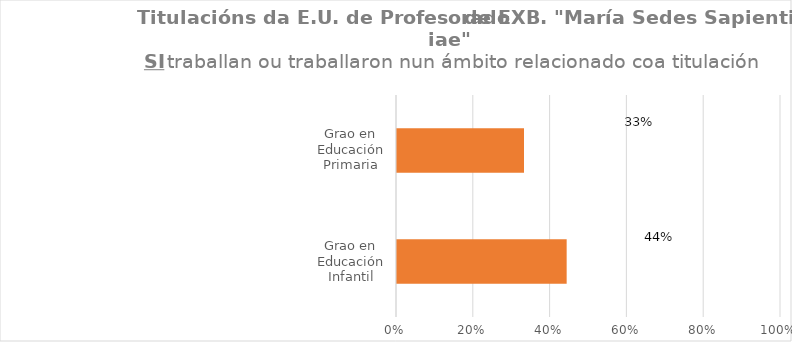
| Category | Series 1 |
|---|---|
| Grao en Educación Infantil | 0.444 |
| Grao en Educación Primaria | 0.333 |